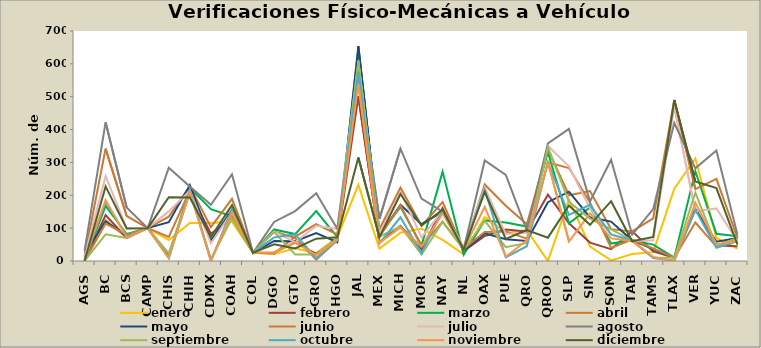
| Category | enero | febrero | marzo | abril | mayo | junio | julio | agosto | septiembre | octubre | noviembre | diciembre |
|---|---|---|---|---|---|---|---|---|---|---|---|---|
| AGS | 0 | 0 | 0 | 13 | 23 | 0 | 14 | 31 | 0 | 0 | 5 | 0 |
| BC | 125 | 140 | 168 | 342 | 121 | 114 | 258 | 422 | 81 | 181 | 185 | 227 |
| BCS | 72 | 70 | 82 | 137 | 75 | 80 | 100 | 163 | 70 | 75 | 72 | 99 |
| CAMP | 100 | 100 | 100 | 100 | 100 | 100 | 100 | 100 | 100 | 100 | 100 | 100 |
| CHIS | 64 | 18 | 10 | 135 | 118 | 73 | 151 | 284 | 23 | 9 | 10 | 194 |
| CHIH | 116 | 209 | 223 | 227 | 231 | 215 | 214 | 227 | 213 | 215 | 210 | 193 |
| CDMX | 116 | 83 | 158 | 103 | 62 | 4 | 54 | 171 | 5 | 0 | 0 | 73 |
| COAH | 120 | 131 | 136 | 189 | 155 | 137 | 149 | 264 | 130 | 157 | 148 | 170 |
| COL | 25 | 25 | 25 | 25 | 25 | 25 | 25 | 25 | 25 | 25 | 25 | 25 |
| DGO | 21 | 26 | 96 | 23 | 61 | 90 | 90 | 119 | 88 | 72 | 26 | 51 |
| GTO | 39 | 56 | 82 | 74 | 60 | 70 | 57 | 152 | 20 | 81 | 57 | 38 |
| GRO | 24 | 22 | 152 | 112 | 85 | 4 | 107 | 206 | 20 | 9 | 18 | 68 |
| HGO | 72 | 61 | 73 | 81 | 57 | 63 | 98 | 98 | 69 | 64 | 64 | 72 |
| JAL | 232 | 502 | 643 | 550 | 654 | 578 | 603 | 574 | 610 | 576 | 539 | 315 |
| MEX | 38 | 58 | 79 | 97 | 76 | 74 | 83 | 128 | 74 | 54 | 55 | 72 |
| MICH | 86 | 107 | 165 | 223 | 171 | 169 | 211 | 342 | 105 | 133 | 102 | 204 |
| MOR | 99 | 35 | 47 | 107 | 112 | 44 | 72 | 190 | 20 | 24 | 44 | 108 |
| NAY | 64 | 161 | 272 | 179 | 150 | 120 | 153 | 150 | 119 | 154 | 145 | 156 |
| NL | 20 | 30 | 19 | 35 | 31 | 37 | 43 | 35 | 35 | 35 | 35 | 35 |
| OAX | 134 | 76 | 123 | 233 | 84 | 88 | 224 | 306 | 122 | 217 | 165 | 210 |
| PUE | 85 | 96 | 117 | 168 | 66 | 90 | 82 | 262 | 42 | 11 | 13 | 67 |
| QRO | 94 | 90 | 105 | 112 | 61 | 68 | 86 | 93 | 55 | 45 | 63 | 94 |
| QROO | 0 | 202 | 331 | 340 | 179 | 300 | 350 | 358 | 347 | 301 | 301 | 71 |
| SLP | 187 | 115 | 115 | 200 | 211 | 283 | 288 | 402 | 180 | 140 | 59 | 169 |
| SIN | 44 | 56 | 163 | 213 | 133 | 178 | 159 | 181 | 129 | 171 | 145 | 110 |
| SON | 2 | 36 | 53 | 97 | 120 | 40 | 81 | 308 | 96 | 81 | 69 | 182 |
| TAB | 21 | 91 | 63 | 90 | 63 | 65 | 60 | 80 | 63 | 62 | 60 | 60 |
| TAMS | 27 | 29 | 50 | 130 | 36 | 38 | 63 | 158 | 11 | 9 | 12 | 73 |
| TLAX | 220 | 10 | 10 | 490 | 10 | 10 | 470 | 420 | 10 | 1 | 0 | 490 |
| VER | 312 | 158 | 273 | 219 | 157 | 117 | 151 | 282 | 208 | 156 | 177 | 242 |
| YUC | 70 | 47 | 83 | 250 | 59 | 44 | 160 | 336 | 46 | 40 | 51 | 222 |
| ZAC | 38 | 45 | 75 | 70 | 70 | 70 | 60 | 80 | 70 | 60 | 60 | 50 |